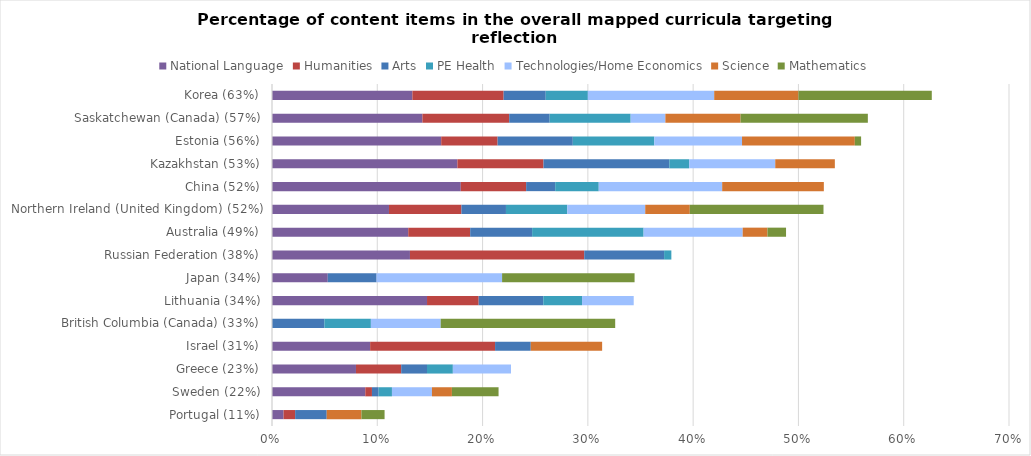
| Category | National Language | Humanities | Arts | PE Health | Technologies/Home Economics | Science | Mathematics |
|---|---|---|---|---|---|---|---|
| Portugal (11%) | 0.011 | 0.011 | 0.03 | 0 | 0 | 0.033 | 0.022 |
| Sweden (22%) | 0.089 | 0.006 | 0.006 | 0.013 | 0.038 | 0.019 | 0.044 |
| Greece (23%) | 0.08 | 0.043 | 0.025 | 0.025 | 0.055 | 0 | 0 |
| Israel (31%) | 0.093 | 0.119 | 0.034 | 0 | 0 | 0.068 | 0 |
| British Columbia (Canada) (33%) | 0 | 0 | 0.05 | 0.044 | 0.066 | 0 | 0.166 |
| Lithuania (34%) | 0.147 | 0.049 | 0.061 | 0.037 | 0.049 | 0 | 0 |
| Japan (34%) | 0.053 | 0 | 0.046 | 0 | 0.119 | 0 | 0.126 |
| Russian Federation (38%) | 0.131 | 0.166 | 0.076 | 0.007 | 0 | 0 | 0 |
| Australia (49%) | 0.129 | 0.059 | 0.059 | 0.106 | 0.094 | 0.024 | 0.018 |
| Northern Ireland (United Kingdom) (52%) | 0.111 | 0.069 | 0.042 | 0.058 | 0.074 | 0.042 | 0.127 |
| China (52%) | 0.179 | 0.062 | 0.028 | 0.041 | 0.117 | 0.097 | 0 |
| Kazakhstan (53%) | 0.176 | 0.082 | 0.119 | 0.019 | 0.082 | 0.057 | 0 |
| Estonia (56%) | 0.161 | 0.054 | 0.071 | 0.077 | 0.083 | 0.107 | 0.006 |
| Saskatchewan (Canada) (57%) | 0.143 | 0.082 | 0.038 | 0.077 | 0.033 | 0.071 | 0.121 |
| Korea (63%) | 0.133 | 0.087 | 0.04 | 0.04 | 0.12 | 0.08 | 0.127 |